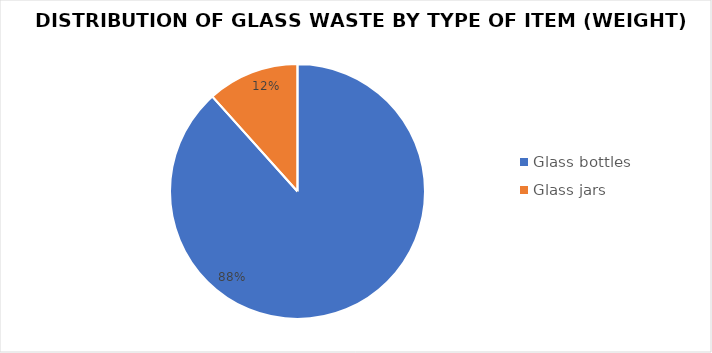
| Category | Series 0 |
|---|---|
| Glass bottles | 1386.999 |
| Glass jars | 182.63 |